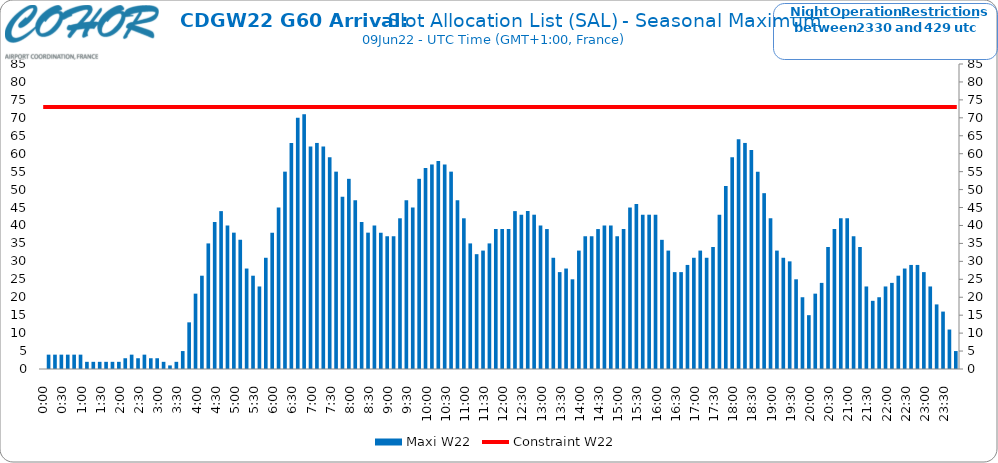
| Category | Maxi W22 |
|---|---|
| 0.0 | 0 |
| 0.006944444444444444 | 4 |
| 0.013888888888888888 | 4 |
| 0.020833333333333332 | 4 |
| 0.027777777777777776 | 4 |
| 0.034722222222222224 | 4 |
| 0.041666666666666664 | 4 |
| 0.04861111111111111 | 2 |
| 0.05555555555555555 | 2 |
| 0.0625 | 2 |
| 0.06944444444444443 | 2 |
| 0.0763888888888889 | 2 |
| 0.08333333333333333 | 2 |
| 0.09027777777777778 | 3 |
| 0.09722222222222222 | 4 |
| 0.10416666666666667 | 3 |
| 0.1111111111111111 | 4 |
| 0.11805555555555557 | 3 |
| 0.125 | 3 |
| 0.13194444444444445 | 2 |
| 0.1388888888888889 | 1 |
| 0.14583333333333334 | 2 |
| 0.15277777777777776 | 5 |
| 0.15972222222222224 | 13 |
| 0.16666666666666666 | 21 |
| 0.17361111111111113 | 26 |
| 0.18055555555555555 | 35 |
| 0.1875 | 41 |
| 0.19444444444444445 | 44 |
| 0.20138888888888887 | 40 |
| 0.20833333333333334 | 38 |
| 0.2152777777777778 | 36 |
| 0.2222222222222222 | 28 |
| 0.22916666666666666 | 26 |
| 0.23611111111111113 | 23 |
| 0.24305555555555555 | 31 |
| 0.25 | 38 |
| 0.2569444444444445 | 45 |
| 0.2638888888888889 | 55 |
| 0.2708333333333333 | 63 |
| 0.2777777777777778 | 70 |
| 0.2847222222222222 | 71 |
| 0.2916666666666667 | 62 |
| 0.2986111111111111 | 63 |
| 0.3055555555555555 | 62 |
| 0.3125 | 59 |
| 0.3194444444444445 | 55 |
| 0.3263888888888889 | 48 |
| 0.3333333333333333 | 53 |
| 0.34027777777777773 | 47 |
| 0.34722222222222227 | 41 |
| 0.3541666666666667 | 38 |
| 0.3611111111111111 | 40 |
| 0.3680555555555556 | 38 |
| 0.375 | 37 |
| 0.3819444444444444 | 37 |
| 0.3888888888888889 | 42 |
| 0.3958333333333333 | 47 |
| 0.40277777777777773 | 45 |
| 0.40972222222222227 | 53 |
| 0.4166666666666667 | 56 |
| 0.4236111111111111 | 57 |
| 0.4305555555555556 | 58 |
| 0.4375 | 57 |
| 0.4444444444444444 | 55 |
| 0.4513888888888889 | 47 |
| 0.4583333333333333 | 42 |
| 0.46527777777777773 | 35 |
| 0.47222222222222227 | 32 |
| 0.4791666666666667 | 33 |
| 0.4861111111111111 | 35 |
| 0.4930555555555556 | 39 |
| 0.5 | 39 |
| 0.5069444444444444 | 39 |
| 0.513888888888889 | 44 |
| 0.5208333333333334 | 43 |
| 0.5277777777777778 | 44 |
| 0.5347222222222222 | 43 |
| 0.5416666666666666 | 40 |
| 0.548611111111111 | 39 |
| 0.5555555555555556 | 31 |
| 0.5625 | 27 |
| 0.5694444444444444 | 28 |
| 0.576388888888889 | 25 |
| 0.5833333333333334 | 33 |
| 0.5902777777777778 | 37 |
| 0.5972222222222222 | 37 |
| 0.6041666666666666 | 39 |
| 0.611111111111111 | 40 |
| 0.6180555555555556 | 40 |
| 0.625 | 37 |
| 0.6319444444444444 | 39 |
| 0.638888888888889 | 45 |
| 0.6458333333333334 | 46 |
| 0.6527777777777778 | 43 |
| 0.6597222222222222 | 43 |
| 0.6666666666666666 | 43 |
| 0.6736111111111112 | 36 |
| 0.6805555555555555 | 33 |
| 0.6875 | 27 |
| 0.6944444444444445 | 27 |
| 0.7013888888888888 | 29 |
| 0.7083333333333334 | 31 |
| 0.7152777777777778 | 33 |
| 0.7222222222222222 | 31 |
| 0.7291666666666666 | 34 |
| 0.7361111111111112 | 43 |
| 0.7430555555555555 | 51 |
| 0.75 | 59 |
| 0.7569444444444445 | 64 |
| 0.7638888888888888 | 63 |
| 0.7708333333333334 | 61 |
| 0.7777777777777778 | 55 |
| 0.7847222222222222 | 49 |
| 0.7916666666666666 | 42 |
| 0.7986111111111112 | 33 |
| 0.8055555555555555 | 31 |
| 0.8125 | 30 |
| 0.8194444444444445 | 25 |
| 0.8263888888888888 | 20 |
| 0.8333333333333334 | 15 |
| 0.8402777777777778 | 21 |
| 0.8472222222222222 | 24 |
| 0.8541666666666666 | 34 |
| 0.8611111111111112 | 39 |
| 0.8680555555555555 | 42 |
| 0.875 | 42 |
| 0.8819444444444445 | 37 |
| 0.8888888888888888 | 34 |
| 0.8958333333333334 | 23 |
| 0.9027777777777778 | 19 |
| 0.9097222222222222 | 20 |
| 0.9166666666666666 | 23 |
| 0.9236111111111112 | 24 |
| 0.9305555555555555 | 26 |
| 0.9375 | 28 |
| 0.9444444444444445 | 29 |
| 0.9513888888888888 | 29 |
| 0.9583333333333334 | 27 |
| 0.9652777777777778 | 23 |
| 0.9722222222222222 | 18 |
| 0.9791666666666666 | 16 |
| 0.9861111111111112 | 11 |
| 0.9930555555555555 | 5 |